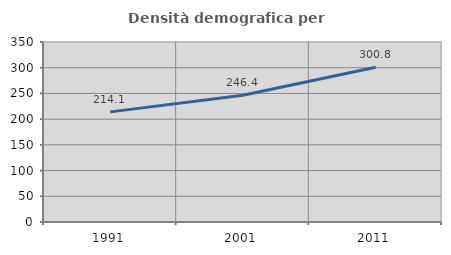
| Category | Densità demografica |
|---|---|
| 1991.0 | 214.12 |
| 2001.0 | 246.417 |
| 2011.0 | 300.84 |